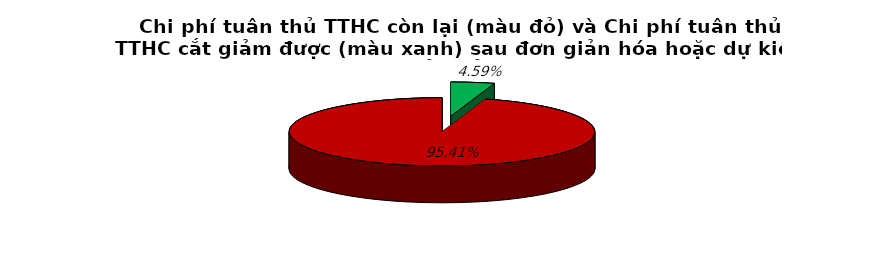
| Category | 4.6% 95.4% |
|---|---|
| 0 | 0.046 |
| 1 | 0.954 |